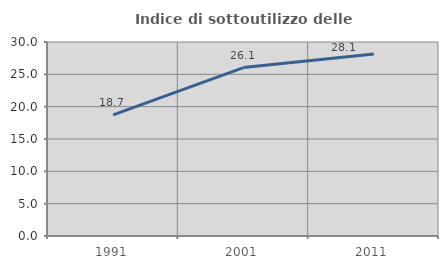
| Category | Indice di sottoutilizzo delle abitazioni  |
|---|---|
| 1991.0 | 18.721 |
| 2001.0 | 26.05 |
| 2011.0 | 28.132 |